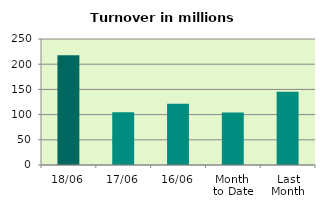
| Category | Series 0 |
|---|---|
| 18/06 | 217.623 |
| 17/06 | 104.634 |
| 16/06 | 121.495 |
| Month 
to Date | 104.132 |
| Last
Month | 145.388 |